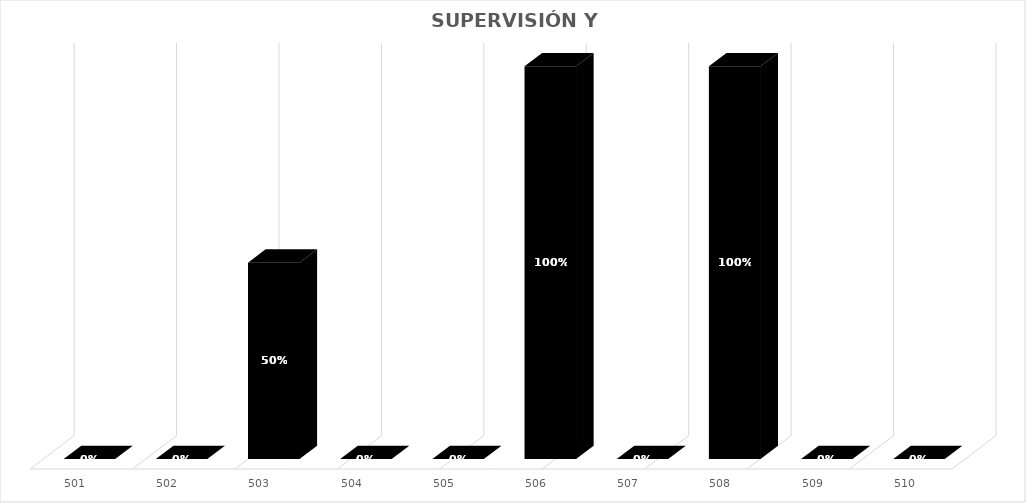
| Category | % Avance semestral |
|---|---|
| 501.0 | 0 |
| 502.0 | 0 |
| 503.0 | 0.5 |
| 504.0 | 0 |
| 505.0 | 0 |
| 506.0 | 1 |
| 507.0 | 0 |
| 508.0 | 1 |
| 509.0 | 0 |
| 510.0 | 0 |